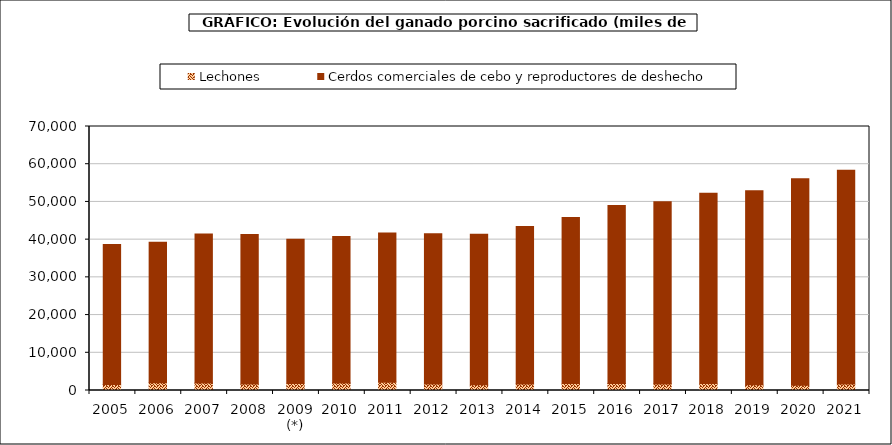
| Category | Lechones | Cerdos comerciales de cebo y reproductores de deshecho |
|---|---|---|
| 2005 | 1577 | 37128 |
| 2006 | 2022.902 | 37254.07 |
| 2007 | 1975.516 | 39513.029 |
| 2008 | 1749.619 | 39645.973 |
| 2009 (*) | 1874.979 | 38242.923 |
| 2010 | 1998.726 | 38848.29 |
| 2011 | 2197.864 | 39545.499 |
| 2012 | 1747.365 | 39847.191 |
| 2013 | 1527.256 | 39891.21 |
| 2014 | 1743.639 | 41739.934 |
| 2015 | 1882.976 | 44007.548 |
| 2016 | 1872.511 | 47211.274 |
| 2017 | 1728.098 | 48344.657 |
| 2018 | 1849.672 | 50439.528 |
| 2019 | 1555.988 | 51426.326 |
| 2020 | 1374.901 | 54755.127 |
| 2021 | 1706.411 | 56664.074 |